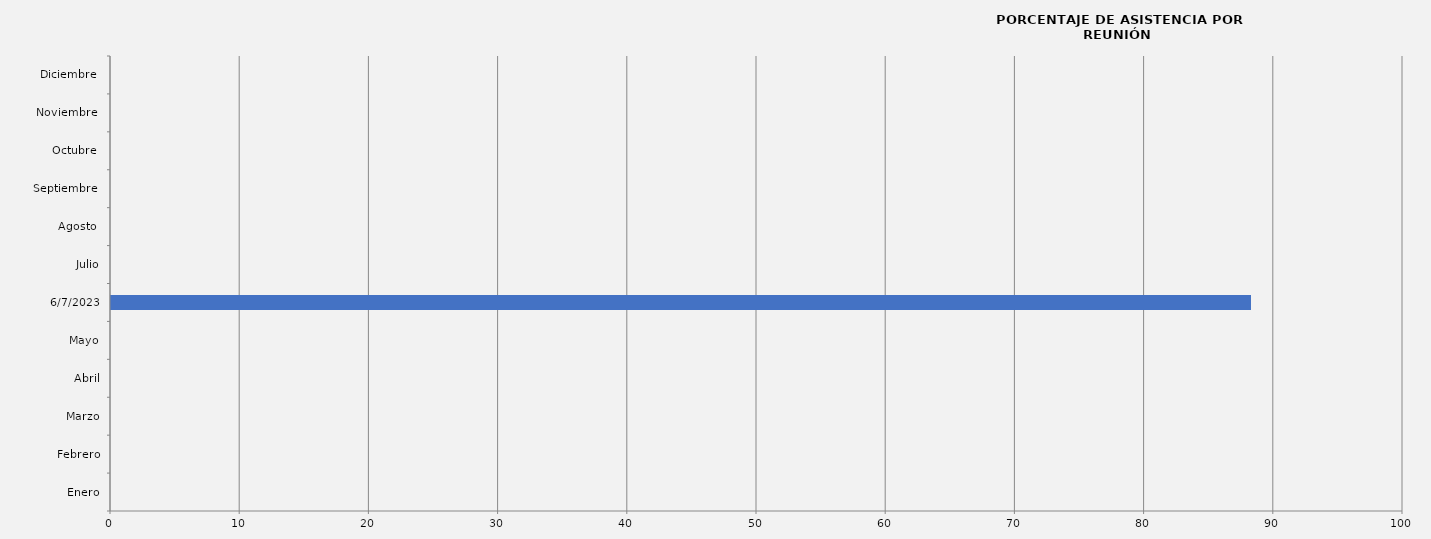
| Category | Series 0 |
|---|---|
| Enero | 0 |
| Febrero | 0 |
| Marzo | 0 |
| Abril | 0 |
| Mayo | 0 |
| 07/06/2023 | 88.235 |
| Julio | 0 |
| Agosto  | 0 |
| Septiembre  | 0 |
| Octubre  | 0 |
| Noviembre  | 0 |
| Diciembre  | 0 |